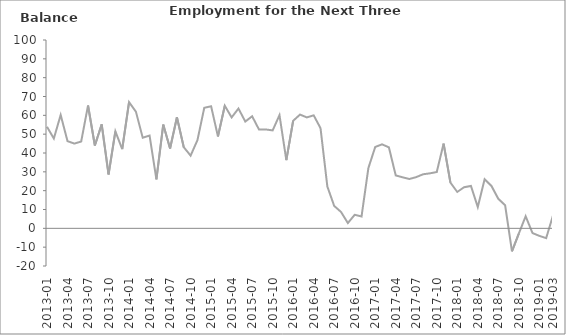
| Category | Balance |
|---|---|
| 2013-01 | 53.9 |
|  | 47.7 |
|  | 60.2 |
| 2013-04 | 46.3 |
|  | 45 |
|  | 46.1 |
| 2013-07 | 65.2 |
|  | 44 |
|  | 55.2 |
| 2013-10 | 28.6 |
|  | 51.5 |
|  | 42.1 |
| 2014-01 | 67 |
|  | 62 |
|  | 48.1 |
| 2014-04 | 49.3 |
|  | 26 |
|  | 55.1 |
| 2014-07 | 42.4 |
|  | 59 |
|  | 43.1 |
| 2014-10 | 38.6 |
|  | 46.8 |
|  | 64 |
| 2015-01 | 64.8 |
|  | 48.8 |
|  | 65.1 |
| 2015-04 | 58.9 |
|  | 63.6 |
|  | 56.7 |
| 2015-07 | 59.5 |
|  | 52.5 |
|  | 52.5 |
| 2015-10 | 52 |
|  | 60.1 |
|  | 36.2 |
| 2016-01 | 57.1 |
|  | 60.4 |
|  | 58.9 |
| 2016-04 | 60 |
|  | 53.2 |
|  | 22.2 |
| 2016-07 | 11.9 |
|  | 8.7 |
|  | 2.8 |
| 2016-10 | 7.2 |
|  | 6.3 |
|  | 32 |
| 2017-01 | 43.2 |
|  | 44.6 |
|  | 43 |
| 2017-04 | 28.1 |
|  | 27.1 |
|  | 26.2 |
| 2017-07 | 27.2 |
|  | 28.7 |
|  | 29.2 |
| 2017-10 | 29.9 |
|  | 45 |
|  | 24.3 |
| 2018-01 | 19.3 |
|  | 21.8 |
|  | 22.5 |
| 2018-04 | 11.3 |
|  | 26.1 |
|  | 22.5 |
| 2018-07 | 15.7 |
|  | 12.2 |
|  | -12.2 |
| 2018-10 | -2.8 |
|  | 6.4 |
|  | -2.5 |
| 2019-01 | -4 |
|  | -5.2 |
| 2019-03 | 6.8 |